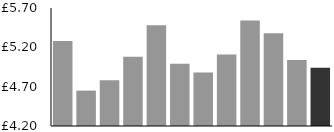
| Category | Average sales value per customer (£) |
|---|---|
| Jan | 5.28 |
| Feb | 4.65 |
| Mar | 4.78 |
| April | 5.08 |
| May | 5.48 |
| Jun | 4.99 |
| Jul | 4.88 |
| Aug | 5.11 |
| Sep | 5.54 |
| Oct | 5.38 |
| Nov | 5.04 |
| Dec | 4.94 |